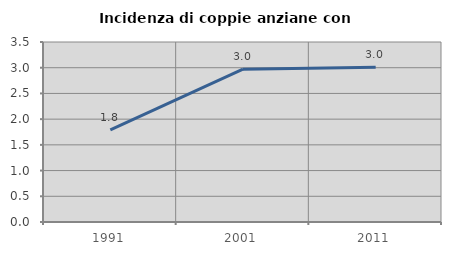
| Category | Incidenza di coppie anziane con figli |
|---|---|
| 1991.0 | 1.793 |
| 2001.0 | 2.971 |
| 2011.0 | 3.009 |